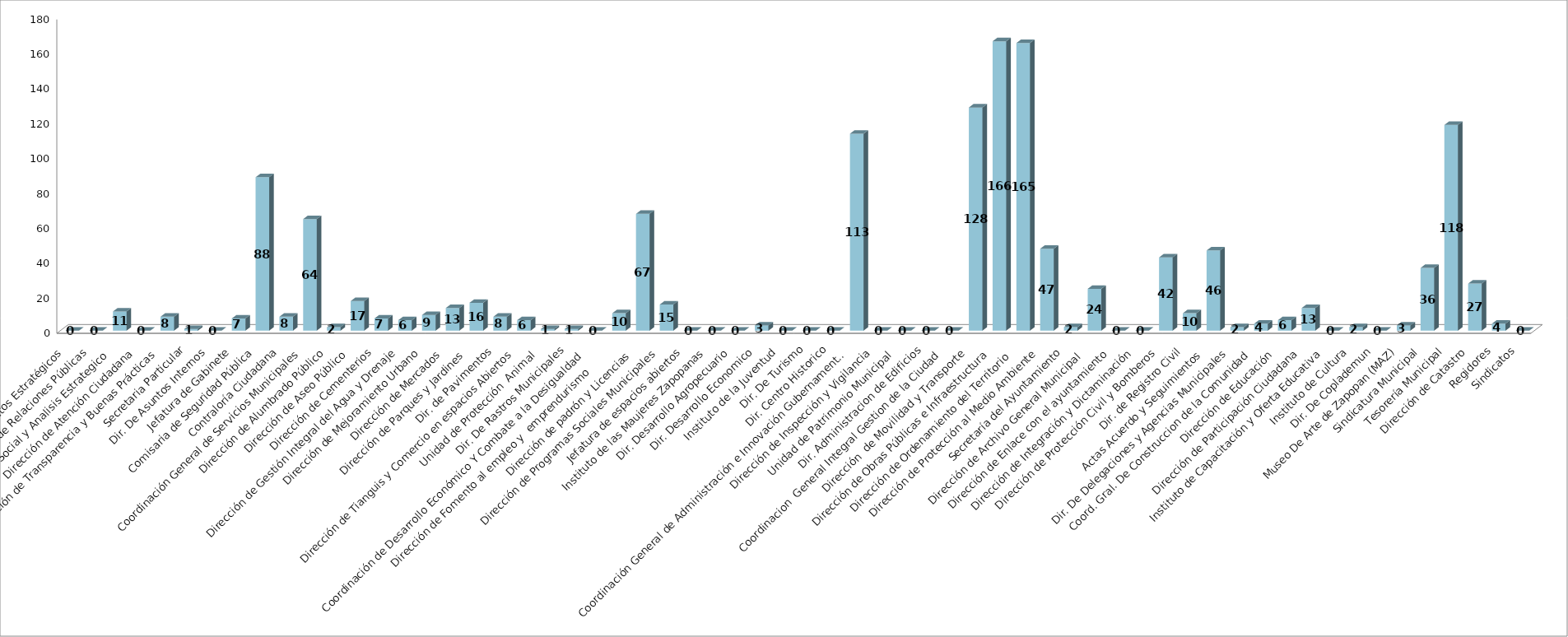
| Category | Series 0 | Series 1 |
|---|---|---|
| Area de Proyectos Estratégicos |  | 0 |
| Área de Relaciones Públicas |  | 0 |
| Comunicación Social y Analisis Estrategico  |  | 11 |
| Dirección de Atención Ciudadana |  | 0 |
| Dirección de Transparencia y Buenas Prácticas |  | 8 |
| Secretaria Particular |  | 1 |
| Dir. De Asuntos Internos |  | 0 |
| Jefatura de Gabinete |  | 7 |
| Comisaria de Seguridad Pública |  | 88 |
| Contraloría Ciudadana |  | 8 |
| Coordinación General de Servicios Municipales |  | 64 |
| Dirección de Alumbrado Público |  | 2 |
| Dirección de Aseo Público  |  | 17 |
| Dirección de Cementerios |  | 7 |
| Dirección de Gestión Integral del Agua y Drenaje |  | 6 |
| Dirección de Mejoramiento Urbano |  | 9 |
| Dirección de Mercados  |  | 13 |
| Dirección de Parques y Jardines  |  | 16 |
| Dir. de Pavimentos |  | 8 |
| Dirección de Tianguis y Comercio en espacios Abiertos |  | 6 |
| Unidad de Protección  Animal  |  | 1 |
| Dir. De Rastros Municipales |  | 1 |
| Coordinación de Desarrollo Económico Y Combate a la Desigualdad |  | 0 |
| Dirección de Fomento al empleo y  emprendurismo         |  | 10 |
| Dirección de padrón y Licencias  |  | 67 |
| Dirección de Programas Sociales Municipales |  | 15 |
| Jefatura de espacios abiertos |  | 0 |
| Instituto de las Maujeres Zapopanas |  | 0 |
|  Dir. Desarrollo Agropecuario |  | 0 |
| Dir. Desarrollo Economico |  | 3 |
| Instituto de la Juventud |  | 0 |
| Dir. De Turismo |  | 0 |
| Dir. Centro Historico |  | 0 |
| Coordinación General de Administración e Innovación Gubernamental |  | 113 |
| Dirección de Inspección y Vigilancia |  | 0 |
| Unidad de Patrimonio Municipal  |  | 0 |
| Dir. Administracion de Edificios |  | 0 |
| Coordinacion  General Integral Gestion de la Ciudad |  | 0 |
| Dirección  de Movilidad y Transporte |  | 128 |
| Dirección de Obras Públicas e Infraestructura |  | 166 |
| Dirección de Ordenamiento del Territorio  |  | 165 |
| Dirección de Protección al Medio Ambiente  |  | 47 |
| Secretaría del Ayuntamiento |  | 2 |
| Dirección de Archivo General Municipal  |  | 24 |
| Dirección de Enlace con el ayuntamiento |  | 0 |
| Dirección de Integración y Dictaminación |  | 0 |
| Dirección de Protección Civil y Bomberos |  | 42 |
| Dir. de Registro Civil |  | 10 |
| Actas Acuerdo y Seguimientos  |  | 46 |
| Dir. De Delegaciones y Agencias Municipales |  | 2 |
| Coord. Gral. De Construccion de la Comunidad |  | 4 |
| Dirección de Educación  |  | 6 |
| Dirección de Participación Ciudadana |  | 13 |
| Instituto de Capacitación y Oferta Educativa |  | 0 |
| Instituto de Cultura  |  | 2 |
| Dir. De Coplademun |  | 0 |
| Museo De Arte de Zapopan (MAZ) |  | 3 |
| Sindicatura Municipal |  | 36 |
| Tesorería Municipal |  | 118 |
| Dirección de Catastro |  | 27 |
| Regidores |  | 4 |
| Sindicatos |  | 0 |